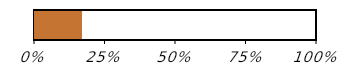
| Category | Kaufstatus (1 von 6) |
|---|---|
| Gekauft | 0.167 |